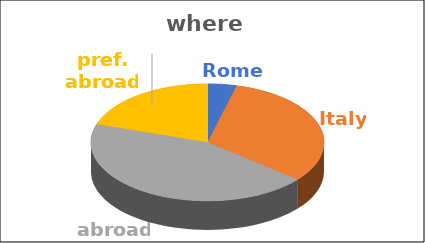
| Category | where | Series 1 | Series 2 | Series 3 | Series 4 |
|---|---|---|---|---|---|
| Rome | 0.04 |  |  |  |  |
| Italy | 0.32 |  |  |  |  |
| abroad | 0.44 |  |  |  |  |
| pref. abroad | 0.2 |  |  |  |  |